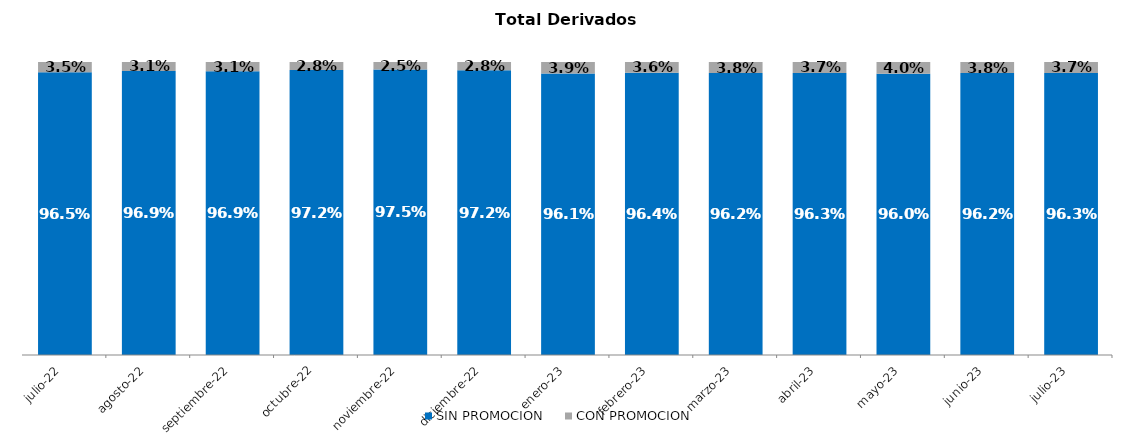
| Category | SIN PROMOCION   | CON PROMOCION   |
|---|---|---|
| 2022-07-01 | 0.965 | 0.035 |
| 2022-08-01 | 0.969 | 0.031 |
| 2022-09-01 | 0.969 | 0.031 |
| 2022-10-01 | 0.972 | 0.028 |
| 2022-11-01 | 0.975 | 0.025 |
| 2022-12-01 | 0.972 | 0.028 |
| 2023-01-01 | 0.961 | 0.039 |
| 2023-02-01 | 0.964 | 0.036 |
| 2023-03-01 | 0.962 | 0.038 |
| 2023-04-01 | 0.963 | 0.037 |
| 2023-05-01 | 0.96 | 0.04 |
| 2023-06-01 | 0.962 | 0.038 |
| 2023-07-01 | 0.963 | 0.037 |